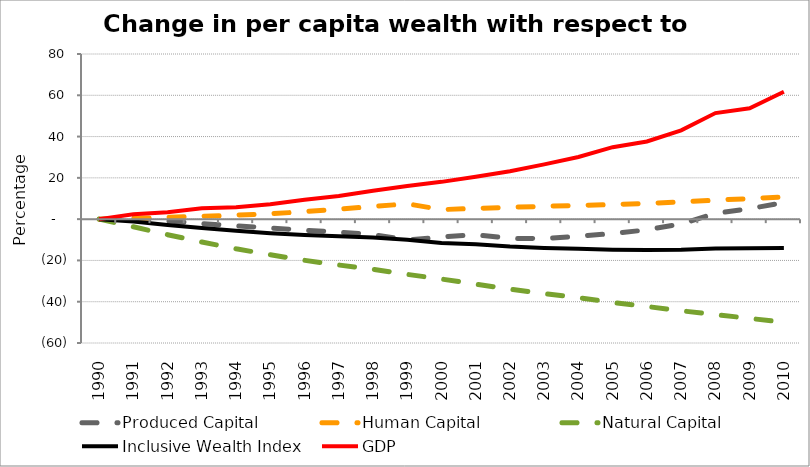
| Category | Produced Capital  | Human Capital | Natural Capital | Inclusive Wealth Index | GDP |
|---|---|---|---|---|---|
| 1990.0 | 0 | 0 | 0 | 0 | 0 |
| 1991.0 | 0.495 | 0.401 | -3.679 | -1.199 | 2.357 |
| 1992.0 | -0.873 | 0.856 | -7.535 | -2.849 | 3.342 |
| 1993.0 | -2.18 | 1.369 | -11.065 | -4.334 | 5.328 |
| 1994.0 | -3.236 | 1.939 | -14.365 | -5.651 | 5.819 |
| 1995.0 | -4.262 | 2.562 | -17.252 | -6.777 | 7.214 |
| 1996.0 | -5.363 | 3.649 | -19.944 | -7.661 | 9.36 |
| 1997.0 | -6.334 | 4.852 | -22.225 | -8.31 | 11.233 |
| 1998.0 | -7.459 | 6.13 | -24.274 | -8.871 | 13.741 |
| 1999.0 | -10.145 | 7.424 | -26.765 | -9.937 | 16.02 |
| 2000.0 | -8.61 | 4.617 | -29.008 | -11.585 | 18.062 |
| 2001.0 | -7.504 | 5.201 | -31.515 | -12.116 | 20.486 |
| 2002.0 | -9.316 | 5.722 | -33.88 | -13.244 | 23.235 |
| 2003.0 | -9.445 | 6.201 | -36.034 | -13.941 | 26.55 |
| 2004.0 | -8.231 | 6.662 | -38.009 | -14.286 | 30.11 |
| 2005.0 | -6.978 | 7.097 | -40.372 | -14.786 | 34.852 |
| 2006.0 | -5.188 | 7.621 | -42.325 | -14.973 | 37.615 |
| 2007.0 | -2.316 | 8.38 | -44.387 | -14.88 | 43.009 |
| 2008.0 | 2.773 | 9.163 | -46.215 | -14.207 | 51.388 |
| 2009.0 | 5.109 | 9.965 | -48.065 | -14.128 | 53.729 |
| 2010.0 | 7.992 | 10.802 | -49.995 | -13.95 | 61.741 |